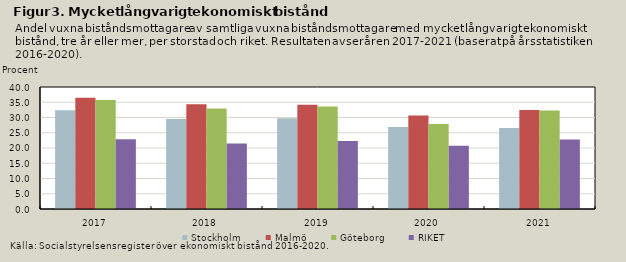
| Category | Stockholm | Malmö | Göteborg | RIKET |
|---|---|---|---|---|
| 2017.0 | 32.337 | 36.478 | 35.725 | 22.9 |
| 2018.0 | 29.514 | 34.361 | 32.981 | 21.465 |
| 2019.0 | 29.756 | 34.205 | 33.614 | 22.274 |
| 2020.0 | 26.856 | 30.648 | 27.841 | 20.745 |
| 2021.0 | 26.533 | 32.463 | 32.312 | 22.755 |